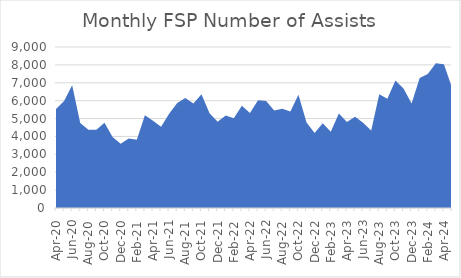
| Category | Number of Assists |
|---|---|
| 2020-04-01 | 5540 |
| 2020-05-01 | 5987 |
| 2020-06-01 | 6862 |
| 2020-07-01 | 4748 |
| 2020-08-01 | 4376 |
| 2020-09-01 | 4370 |
| 2020-10-01 | 4764 |
| 2020-11-01 | 3971 |
| 2020-12-01 | 3585 |
| 2021-01-01 | 3890 |
| 2021-02-01 | 3809 |
| 2021-03-01 | 5179 |
| 2021-04-01 | 4880 |
| 2021-05-01 | 4548 |
| 2021-06-01 | 5264 |
| 2021-07-01 | 5866 |
| 2021-08-01 | 6150 |
| 2021-09-01 | 5842 |
| 2021-10-01 | 6352 |
| 2021-11-01 | 5291 |
| 2021-12-01 | 4818 |
| 2022-01-01 | 5164 |
| 2022-02-01 | 5013 |
| 2022-03-01 | 5710 |
| 2022-04-01 | 5314 |
| 2022-05-01 | 6017 |
| 2022-06-01 | 5982 |
| 2022-07-01 | 5447 |
| 2022-08-01 | 5546 |
| 2022-09-01 | 5396 |
| 2022-10-01 | 6325 |
| 2022-11-01 | 4777 |
| 2022-12-01 | 4198 |
| 2023-01-01 | 4736 |
| 2023-02-01 | 4268 |
| 2023-03-01 | 5279 |
| 2023-04-01 | 4805 |
| 2023-05-01 | 5100 |
| 2023-06-01 | 4766 |
| 2023-07-01 | 4336 |
| 2023-08-01 | 6359 |
| 2023-09-01 | 6103 |
| 2023-10-01 | 7132 |
| 2023-11-01 | 6676 |
| 2023-12-01 | 5836 |
| 2024-01-01 | 7265 |
| 2024-02-01 | 7489 |
| 2024-03-01 | 8093 |
| 2024-04-01 | 8040 |
| 2024-05-01 | 6727 |